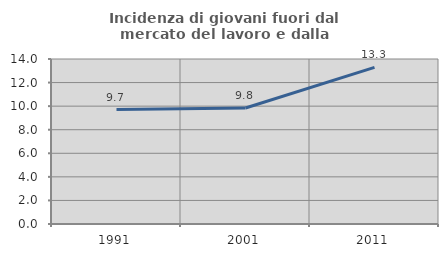
| Category | Incidenza di giovani fuori dal mercato del lavoro e dalla formazione  |
|---|---|
| 1991.0 | 9.714 |
| 2001.0 | 9.838 |
| 2011.0 | 13.292 |